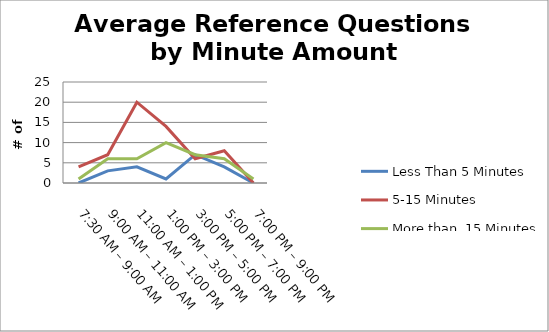
| Category | Less Than 5 Minutes | 5-15 Minutes | More than  15 Minutes |
|---|---|---|---|
| 7:30 AM – 9:00 AM | 0 | 4 | 1 |
| 9:00 AM – 11:00 AM | 3 | 7 | 6 |
| 11:00 AM – 1:00 PM | 4 | 20 | 6 |
| 1:00 PM – 3:00 PM | 1 | 14 | 10 |
| 3:00 PM – 5:00 PM | 7 | 6 | 7 |
| 5:00 PM – 7:00 PM | 4 | 8 | 6 |
| 7:00 PM – 9:00 PM | 0 | 0 | 1 |